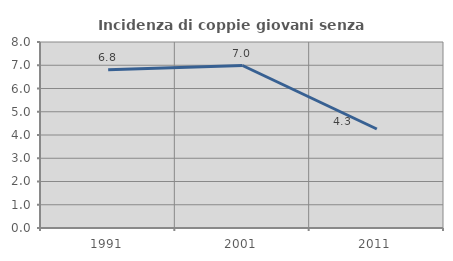
| Category | Incidenza di coppie giovani senza figli |
|---|---|
| 1991.0 | 6.811 |
| 2001.0 | 6.989 |
| 2011.0 | 4.259 |